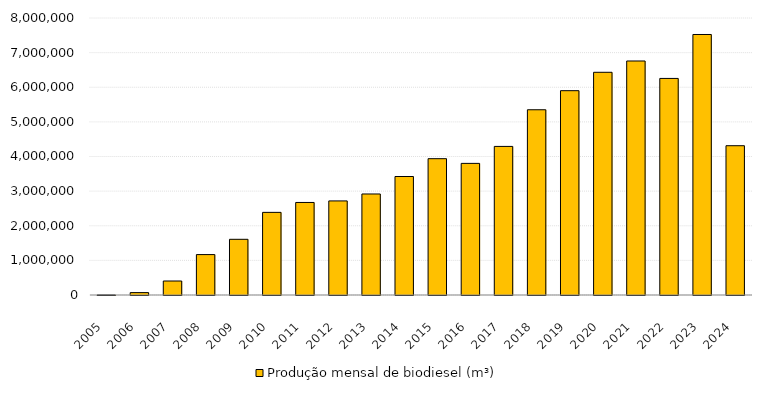
| Category | Produção mensal de biodiesel (m³) |
|---|---|
| 2005.0 | 736.16 |
| 2006.0 | 69001.981 |
| 2007.0 | 404329.14 |
| 2008.0 | 1167128.415 |
| 2009.0 | 1608448.417 |
| 2010.0 | 2386398.518 |
| 2011.0 | 2672759.918 |
| 2012.0 | 2717483.489 |
| 2013.0 | 2917488.269 |
| 2014.0 | 3422209.897 |
| 2015.0 | 3937268.534 |
| 2016.0 | 3801338.998 |
| 2017.0 | 4291293.772 |
| 2018.0 | 5350036.398 |
| 2019.0 | 5901104.354 |
| 2020.0 | 6432036.594 |
| 2021.0 | 6758382.372 |
| 2022.0 | 6254710.27 |
| 2023.0 | 7523835.98 |
| 2024.0 | 4311643.728 |